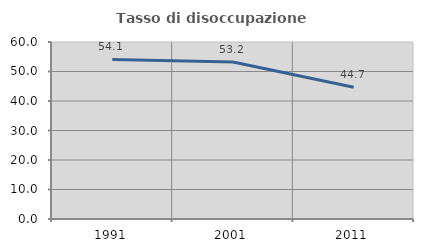
| Category | Tasso di disoccupazione giovanile  |
|---|---|
| 1991.0 | 54.098 |
| 2001.0 | 53.191 |
| 2011.0 | 44.681 |